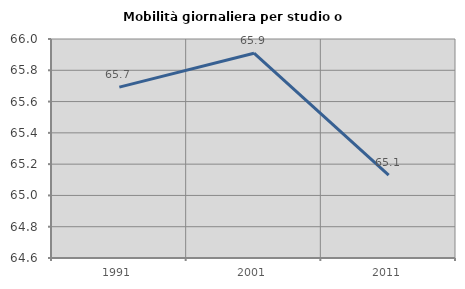
| Category | Mobilità giornaliera per studio o lavoro |
|---|---|
| 1991.0 | 65.692 |
| 2001.0 | 65.909 |
| 2011.0 | 65.13 |